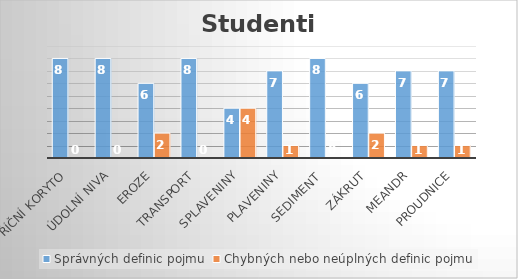
| Category | Správných definic pojmu | Chybných nebo neúplných definic pojmu |
|---|---|---|
| Říční koryto | 8 | 0 |
| Údolní niva | 8 | 0 |
| Eroze | 6 | 2 |
| Transport | 8 | 0 |
| Splaveniny | 4 | 4 |
| Plaveniny | 7 | 1 |
| Sediment  | 8 | 0 |
| Zákrut | 6 | 2 |
| Meandr | 7 | 1 |
| Proudnice | 7 | 1 |